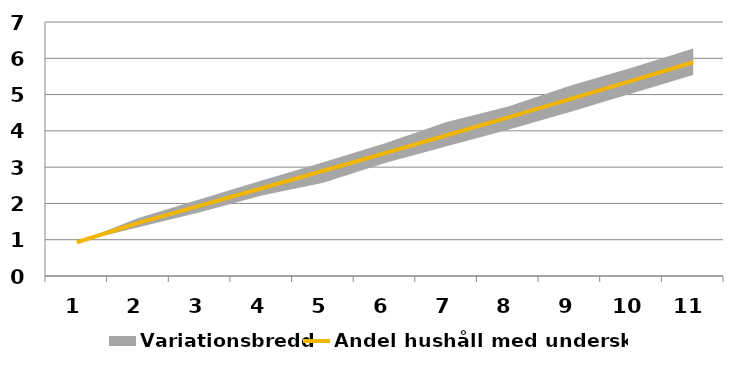
| Category | Andel hushåll med underskott |
|---|---|
| 0 | 0.931 |
| 1 | 1.464 |
| 2 | 1.939 |
| 3 | 2.417 |
| 4 | 2.899 |
| 5 | 3.387 |
| 6 | 3.878 |
| 7 | 4.373 |
| 8 | 4.874 |
| 9 | 5.38 |
| 10 | 5.89 |